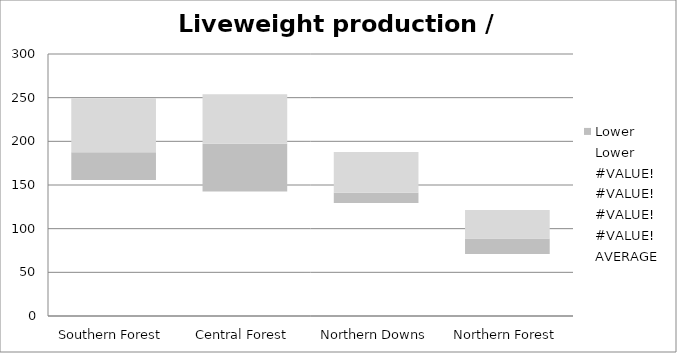
| Category | Lower | Upper |
|---|---|---|
| Southern Forest | 31.9 | 61.8 |
| Central Forest | 54.6 | 56.6 |
| Northern Downs | 11.9 | 46.6 |
| Northern Forest | 17.9 | 32.6 |